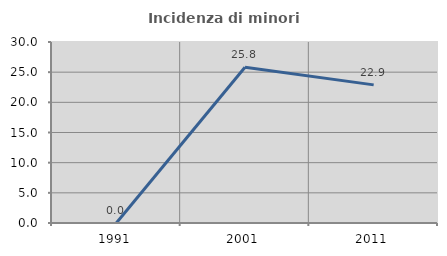
| Category | Incidenza di minori stranieri |
|---|---|
| 1991.0 | 0 |
| 2001.0 | 25.806 |
| 2011.0 | 22.892 |